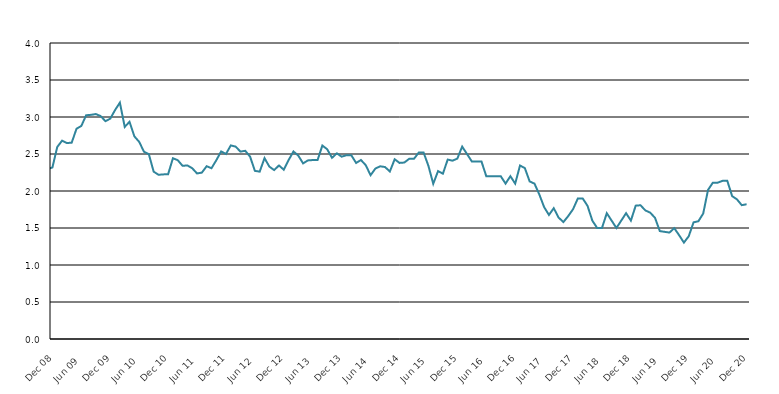
| Category | Series 1 |
|---|---|
| 2006-01-01 | 3.5 |
| 2006-02-01 | 3.4 |
| 2006-03-01 | 3.5 |
| 2006-04-01 | 3.4 |
| 2006-05-01 | 3.2 |
| 2006-06-01 | 3 |
| 2006-07-01 | 3 |
| 2006-08-01 | 3.2 |
| 2006-09-01 | 3.1 |
| 2006-10-01 | 3.1 |
| 2006-11-01 | 3 |
| 2006-12-01 | 3.3 |
| 2007-01-01 | 3.4 |
| 2007-02-01 | 3.3 |
| 2007-03-01 | 3.1 |
| 2007-04-01 | 2.8 |
| 2007-05-01 | 2.6 |
| 2007-06-01 | 2.7 |
| 2007-07-01 | 2.8 |
| 2007-08-01 | 2.9 |
| 2007-09-01 | 2.8 |
| 2007-10-01 | 2.7 |
| 2007-11-01 | 2.7 |
| 2007-12-01 | 2.7 |
| 2008-01-01 | 2.59 |
| 2008-02-01 | 2.48 |
| 2008-03-01 | 2.513 |
| 2008-04-01 | 2.397 |
| 2008-05-01 | 2.075 |
| 2008-06-01 | 2.136 |
| 2008-07-01 | 2.225 |
| 2008-08-01 | 2.259 |
| 2008-09-01 | 2.125 |
| 2008-10-01 | 2.181 |
| 2008-11-01 | 2.297 |
| 2008-12-01 | 2.318 |
| 2009-01-01 | 2.594 |
| 2009-02-01 | 2.68 |
| 2009-03-01 | 2.648 |
| 2009-04-01 | 2.653 |
| 2009-05-01 | 2.842 |
| 2009-06-01 | 2.879 |
| 2009-07-01 | 3.024 |
| 2009-08-01 | 3.029 |
| 2009-09-01 | 3.04 |
| 2009-10-01 | 3.013 |
| 2009-11-01 | 2.943 |
| 2009-12-01 | 2.978 |
| 2010-01-01 | 3.094 |
| 2010-02-01 | 3.195 |
| 2010-03-01 | 2.866 |
| 2010-04-01 | 2.935 |
| 2010-05-01 | 2.739 |
| 2010-06-01 | 2.664 |
| 2010-07-01 | 2.53 |
| 2010-08-01 | 2.498 |
| 2010-09-01 | 2.262 |
| 2010-10-01 | 2.219 |
| 2010-11-01 | 2.224 |
| 2010-12-01 | 2.226 |
| 2011-01-01 | 2.443 |
| 2011-02-01 | 2.416 |
| 2011-03-01 | 2.34 |
| 2011-04-01 | 2.346 |
| 2011-05-01 | 2.308 |
| 2011-06-01 | 2.237 |
| 2011-07-01 | 2.248 |
| 2011-08-01 | 2.335 |
| 2011-09-01 | 2.308 |
| 2011-10-01 | 2.416 |
| 2011-11-01 | 2.535 |
| 2011-12-01 | 2.5 |
| 2012-01-01 | 2.616 |
| 2012-02-01 | 2.6 |
| 2012-03-01 | 2.533 |
| 2012-04-01 | 2.543 |
| 2012-05-01 | 2.465 |
| 2012-06-01 | 2.272 |
| 2012-07-01 | 2.262 |
| 2012-08-01 | 2.444 |
| 2012-09-01 | 2.33 |
| 2012-10-01 | 2.283 |
| 2012-11-01 | 2.345 |
| 2012-12-01 | 2.287 |
| 2013-01-01 | 2.418 |
| 2013-02-01 | 2.534 |
| 2013-03-01 | 2.479 |
| 2013-04-01 | 2.373 |
| 2013-05-01 | 2.413 |
| 2013-06-01 | 2.418 |
| 2013-07-01 | 2.418 |
| 2013-08-01 | 2.614 |
| 2013-09-01 | 2.564 |
| 2013-10-01 | 2.449 |
| 2013-11-01 | 2.509 |
| 2013-12-01 | 2.464 |
| 2014-01-01 | 2.484 |
| 2014-02-01 | 2.484 |
| 2014-03-01 | 2.379 |
| 2014-04-01 | 2.419 |
| 2014-05-01 | 2.349 |
| 2014-06-01 | 2.213 |
| 2014-07-01 | 2.304 |
| 2014-08-01 | 2.334 |
| 2014-09-01 | 2.324 |
| 2014-10-01 | 2.264 |
| 2014-11-01 | 2.429 |
| 2014-12-01 | 2.38 |
| 2015-01-01 | 2.385 |
| 2015-02-01 | 2.435 |
| 2015-03-01 | 2.435 |
| 2015-04-01 | 2.52 |
| 2015-05-01 | 2.52 |
| 2015-06-01 | 2.339 |
| 2015-07-01 | 2.098 |
| 2015-08-01 | 2.269 |
| 2015-09-01 | 2.234 |
| 2015-10-01 | 2.425 |
| 2015-11-01 | 2.41 |
| 2015-12-01 | 2.438 |
| 2016-01-01 | 2.6 |
| 2016-02-01 | 2.5 |
| 2016-03-01 | 2.4 |
| 2016-04-01 | 2.4 |
| 2016-05-01 | 2.4 |
| 2016-06-01 | 2.2 |
| 2016-07-01 | 2.2 |
| 2016-08-01 | 2.2 |
| 2016-09-01 | 2.2 |
| 2016-10-01 | 2.1 |
| 2016-11-01 | 2.2 |
| 2016-12-01 | 2.1 |
| 2017-01-01 | 2.344 |
| 2017-02-01 | 2.31 |
| 2017-03-01 | 2.13 |
| 2017-04-01 | 2.099 |
| 2017-05-01 | 1.954 |
| 2017-06-01 | 1.783 |
| 2017-07-01 | 1.677 |
| 2017-08-01 | 1.767 |
| 2017-09-01 | 1.641 |
| 2017-10-01 | 1.58 |
| 2017-11-01 | 1.661 |
| 2017-12-01 | 1.754 |
| 2018-01-01 | 1.9 |
| 2018-02-01 | 1.9 |
| 2018-03-01 | 1.8 |
| 2018-04-01 | 1.6 |
| 2018-05-01 | 1.5 |
| 2018-06-01 | 1.5 |
| 2018-07-01 | 1.7 |
| 2018-08-01 | 1.6 |
| 2018-09-01 | 1.5 |
| 2018-10-01 | 1.6 |
| 2018-11-01 | 1.7 |
| 2018-12-01 | 1.6 |
| 2019-01-01 | 1.802 |
| 2019-02-01 | 1.807 |
| 2019-03-01 | 1.738 |
| 2019-04-01 | 1.708 |
| 2019-05-01 | 1.638 |
| 2019-06-01 | 1.458 |
| 2019-07-01 | 1.448 |
| 2019-08-01 | 1.438 |
| 2019-09-01 | 1.498 |
| 2019-10-01 | 1.403 |
| 2019-11-01 | 1.303 |
| 2019-12-01 | 1.389 |
| 2020-01-01 | 1.577 |
| 2020-02-01 | 1.592 |
| 2020-03-01 | 1.695 |
| 2020-04-01 | 2.015 |
| 2020-05-01 | 2.112 |
| 2020-06-01 | 2.112 |
| 2020-07-01 | 2.137 |
| 2020-08-01 | 2.137 |
| 2020-09-01 | 1.931 |
| 2020-10-01 | 1.887 |
| 2020-11-01 | 1.808 |
| 2020-12-01 | 1.821 |